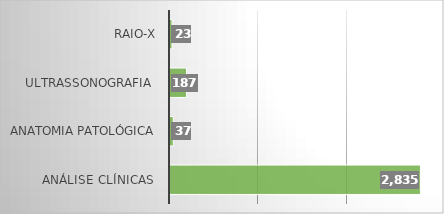
| Category | Series 0 |
|---|---|
| Análise Clínicas  | 2835 |
| Anatomia Patológica | 37 |
| Ultrassonografia  | 187 |
| RAIO-X | 23 |